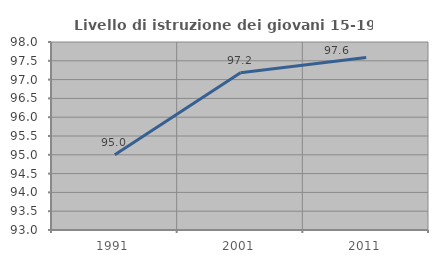
| Category | Livello di istruzione dei giovani 15-19 anni |
|---|---|
| 1991.0 | 95 |
| 2001.0 | 97.183 |
| 2011.0 | 97.59 |